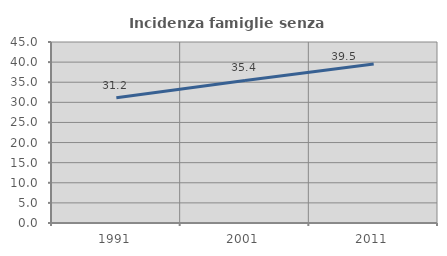
| Category | Incidenza famiglie senza nuclei |
|---|---|
| 1991.0 | 31.165 |
| 2001.0 | 35.433 |
| 2011.0 | 39.541 |